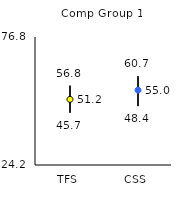
| Category | 25th | 75th | Mean |
|---|---|---|---|
| TFS | 45.7 | 56.8 | 51.17 |
| CSS | 48.4 | 60.7 | 54.95 |